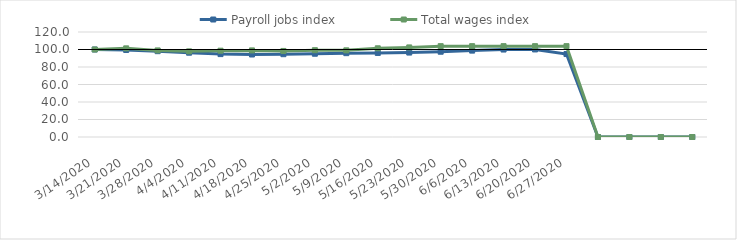
| Category | Payroll jobs index | Total wages index |
|---|---|---|
| 14/03/2020 | 100 | 100 |
| 21/03/2020 | 99.456 | 101.31 |
| 28/03/2020 | 98.072 | 98.957 |
| 04/04/2020 | 96.332 | 97.881 |
| 11/04/2020 | 94.747 | 98.639 |
| 18/04/2020 | 94.283 | 98.971 |
| 25/04/2020 | 94.627 | 98.353 |
| 02/05/2020 | 95.143 | 99.23 |
| 09/05/2020 | 95.808 | 99.042 |
| 16/05/2020 | 96.037 | 101.382 |
| 23/05/2020 | 96.485 | 102.385 |
| 30/05/2020 | 97.454 | 103.836 |
| 06/06/2020 | 98.729 | 103.837 |
| 13/06/2020 | 99.947 | 103.837 |
| 20/06/2020 | 100.059 | 103.837 |
| 27/06/2020 | 94.792 | 103.837 |